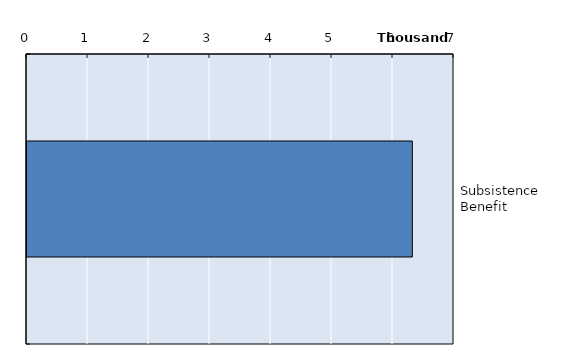
| Category | Series 0 |
|---|---|
| Subsistence Benefit | 6316.767 |